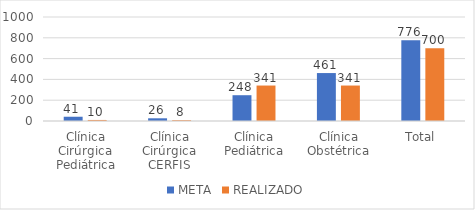
| Category | META | REALIZADO |
|---|---|---|
| Clínica Cirúrgica Pediátrica | 41 | 10 |
| Clínica Cirúrgica CERFIS | 26 | 8 |
| Clínica Pediátrica | 248 | 341 |
| Clínica Obstétrica | 461 | 341 |
| Total | 776 | 700 |